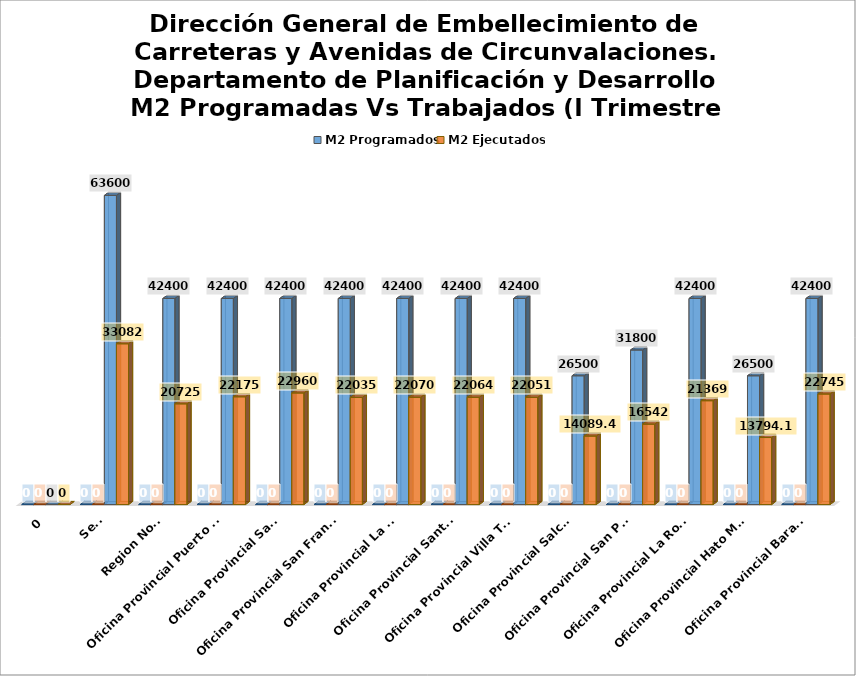
| Category | 0 | M2 Programados | M2 Ejecutados |
|---|---|---|---|
| 0 | 0 | 0 | 0 |
| Sede | 0 | 63600 | 33082 |
| Region Norte | 0 | 42400 | 20725 |
| Oficina Provincial Puerto Plata | 0 | 42400 | 22175 |
| Oficina Provincial Samana | 0 | 42400 | 22960 |
| Oficina Provincial San Francisco | 0 | 42400 | 22035 |
| Oficina Provincial La Vega | 0 | 42400 | 22070 |
| Oficina Provincial Santiago | 0 | 42400 | 22064 |
| Oficina Provincial Villa Tapia | 0 | 42400 | 22051 |
| Oficina Provincial Salcedo  | 0 | 26500 | 14089.49 |
| Oficina Provincial San Pedro | 0 | 31800 | 16542 |
| Oficina Provincial La Romana | 0 | 42400 | 21369 |
| Oficina Provincial Hato Mayor | 0 | 26500 | 13794.19 |
| Oficina Provincial Barahona | 0 | 42400 | 22745 |